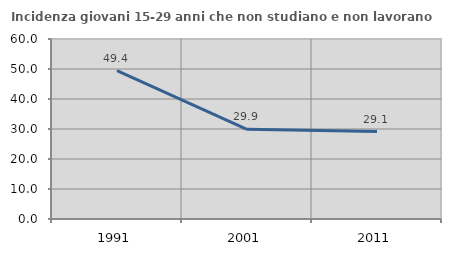
| Category | Incidenza giovani 15-29 anni che non studiano e non lavorano  |
|---|---|
| 1991.0 | 49.438 |
| 2001.0 | 29.891 |
| 2011.0 | 29.129 |